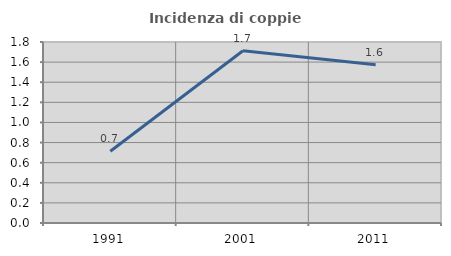
| Category | Incidenza di coppie miste |
|---|---|
| 1991.0 | 0.713 |
| 2001.0 | 1.713 |
| 2011.0 | 1.575 |